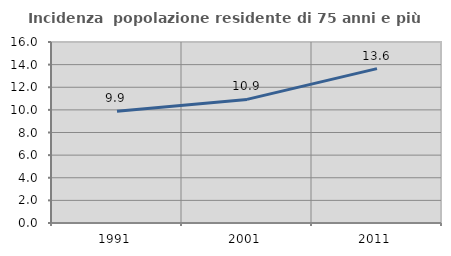
| Category | Incidenza  popolazione residente di 75 anni e più |
|---|---|
| 1991.0 | 9.885 |
| 2001.0 | 10.927 |
| 2011.0 | 13.644 |